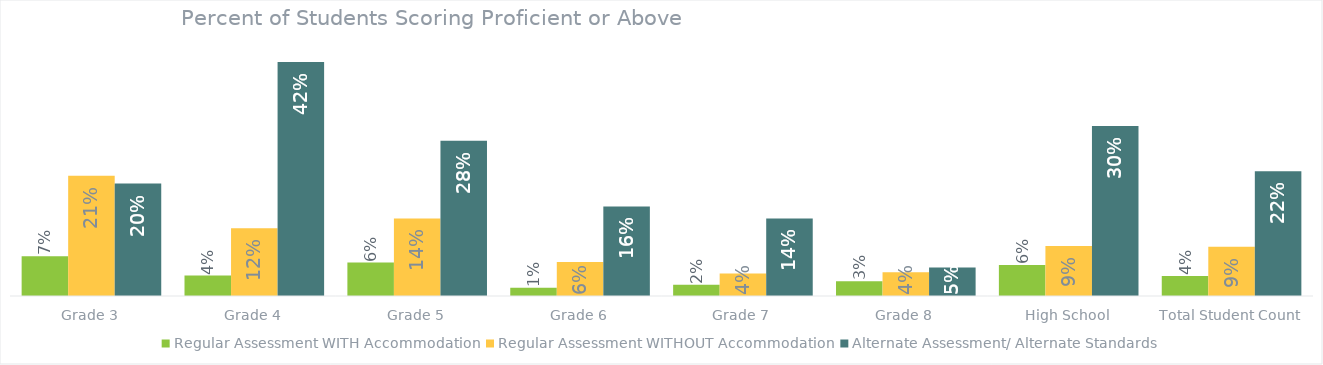
| Category | Regular Assessment WITH Accommodation | Regular Assessment WITHOUT Accommodation | Alternate Assessment/ Alternate Standards |
|---|---|---|---|
| Grade 3 | 0.071 | 0.214 | 0.2 |
| Grade 4 | 0.036 | 0.12 | 0.416 |
| Grade 5 | 0.059 | 0.138 | 0.276 |
| Grade 6 | 0.015 | 0.061 | 0.159 |
| Grade 7 | 0.02 | 0.04 | 0.138 |
| Grade 8 | 0.026 | 0.042 | 0.051 |
| High School | 0.055 | 0.089 | 0.302 |
| Total Student Count | 0.036 | 0.088 | 0.222 |